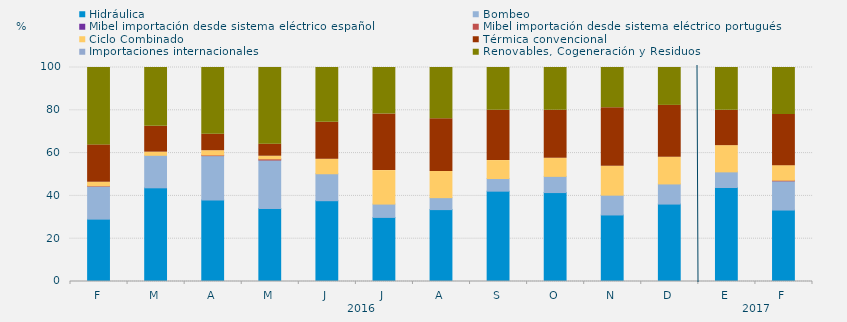
| Category | Hidráulica | Bombeo | Mibel importación desde sistema eléctrico español | Mibel importación desde sistema eléctrico portugués | Ciclo Combinado | Térmica convencional | Importaciones internacionales | Renovables, Cogeneración y Residuos |
|---|---|---|---|---|---|---|---|---|
| F | 29.143 | 15.445 | 0 | 0.144 | 1.652 | 17.457 | 0 | 36.159 |
| M | 43.775 | 15.197 | 0 | 0 | 1.469 | 12.091 | 0 | 27.467 |
| A | 38.09 | 20.729 | 0 | 0.278 | 2.025 | 7.708 | 0 | 31.169 |
| M | 34.117 | 22.648 | 0 | 0.538 | 1.232 | 5.645 | 0 | 35.82 |
| J | 37.755 | 12.593 | 0 | 0 | 6.759 | 17.315 | 0 | 25.579 |
| J | 29.951 | 6.228 | 0 | 0 | 15.636 | 26.478 | 0 | 21.707 |
| A | 33.591 | 5.589 | 0 | 0 | 12.265 | 24.597 | 0 | 23.958 |
| S | 42.211 | 5.903 | 0 | 0 | 8.391 | 23.542 | 0 | 19.954 |
| O | 41.555 | 7.572 | 0 | 0 | 8.468 | 22.469 | 0 | 19.937 |
| N | 31.088 | 9.259 | 0 | 0 | 13.495 | 27.361 | 0 | 18.796 |
| D | 36.178 | 9.409 | 0 | 0 | 12.522 | 24.194 | 0 | 17.697 |
| E | 43.929 | 7.303 | 0 | 0 | 12.254 | 16.51 | 0 | 20.004 |
| F | 33.383 | 13.641 | 0 | 0.298 | 6.82 | 23.884 | 0 | 21.974 |